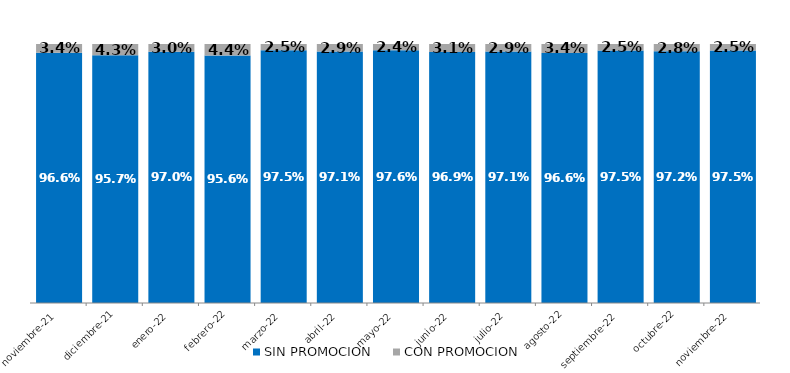
| Category | SIN PROMOCION   | CON PROMOCION   |
|---|---|---|
| 2021-11-01 | 0.966 | 0.034 |
| 2021-12-01 | 0.957 | 0.043 |
| 2022-01-01 | 0.97 | 0.03 |
| 2022-02-01 | 0.956 | 0.044 |
| 2022-03-01 | 0.975 | 0.025 |
| 2022-04-01 | 0.971 | 0.029 |
| 2022-05-01 | 0.976 | 0.024 |
| 2022-06-01 | 0.969 | 0.031 |
| 2022-07-01 | 0.971 | 0.029 |
| 2022-08-01 | 0.966 | 0.034 |
| 2022-09-01 | 0.975 | 0.025 |
| 2022-10-01 | 0.972 | 0.028 |
| 2022-11-01 | 0.975 | 0.025 |